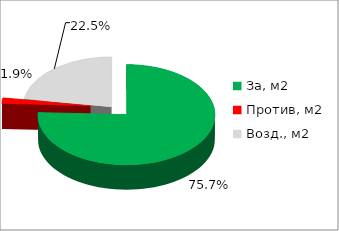
| Category | Series 0 |
|---|---|
| За, м2 | 0.757 |
| Против, м2 | 0.019 |
| Возд., м2 | 0.225 |